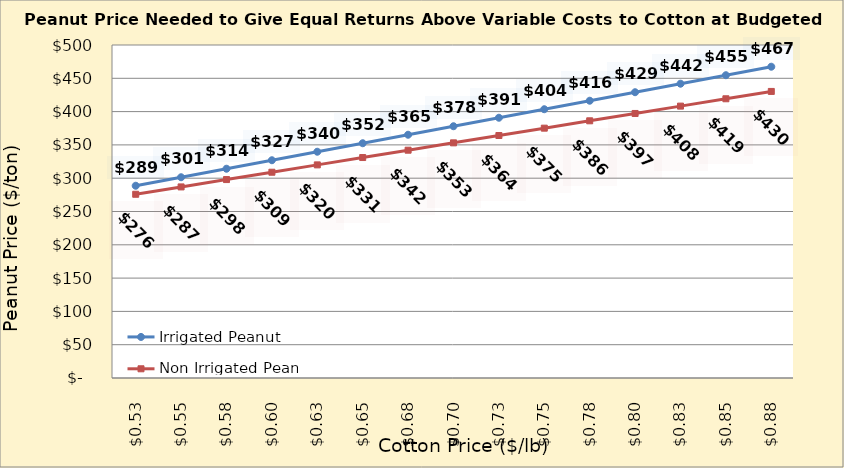
| Category | Irrigated Peanut | Non Irrigated Peanut |
|---|---|---|
| 0.5249999999999998 | 288.666 | 275.875 |
| 0.5499999999999998 | 301.432 | 286.905 |
| 0.5749999999999998 | 314.198 | 297.934 |
| 0.5999999999999999 | 326.964 | 308.963 |
| 0.6249999999999999 | 339.73 | 319.993 |
| 0.6499999999999999 | 352.496 | 331.022 |
| 0.6749999999999999 | 365.262 | 342.052 |
| 0.7 | 378.028 | 353.081 |
| 0.725 | 390.794 | 364.11 |
| 0.75 | 403.56 | 375.14 |
| 0.775 | 416.325 | 386.169 |
| 0.8 | 429.091 | 397.199 |
| 0.8250000000000001 | 441.857 | 408.228 |
| 0.8500000000000001 | 454.623 | 419.257 |
| 0.8750000000000001 | 467.389 | 430.287 |